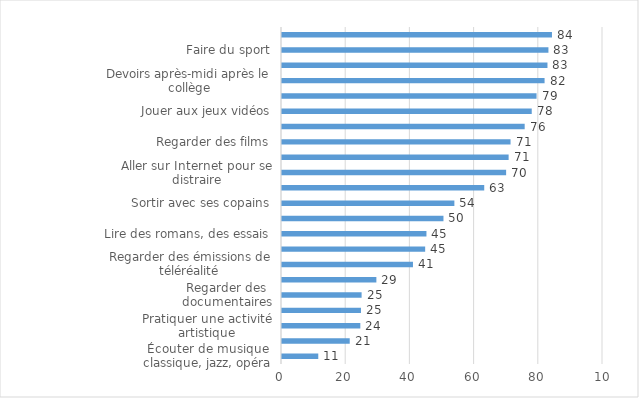
| Category | Series 0 |
|---|---|
| Écouter de musique classique, jazz, opéra | 11.3 |
| Jouer d'un instrument de musique | 21.1 |
| Pratiquer une activité artistique | 24.4 |
| Faire ses devoirs le soir après dîner | 24.6 |
| Regarder des documentaires | 24.8 |
| Lire des magazines | 29.4 |
| Regarder des émissions de téléréalité | 40.8 |
| Aller sur Internet pour s'informer | 44.6 |
| Lire des romans, des essais | 45 |
| Lire des BD | 50.3 |
| Sortir avec ses copains | 53.7 |
| Regarder des dessins animés | 63 |
| Aller sur Internet pour se distraire | 69.82 |
| Chat sur Internet avec ses copains | 70.6 |
| Regarder des films | 71.2 |
| Faire ses devoirs le mercredi après-midi | 75.6 |
| Jouer aux jeux vidéos | 77.8 |
| Écouter des chansons françaises | 79.3 |
| Devoirs après-midi après le collège | 81.8 |
| Écouter du rock, du rap, de la techno | 82.7 |
| Faire du sport | 83 |
| Faire ses devoirs le week-end | 84.1 |